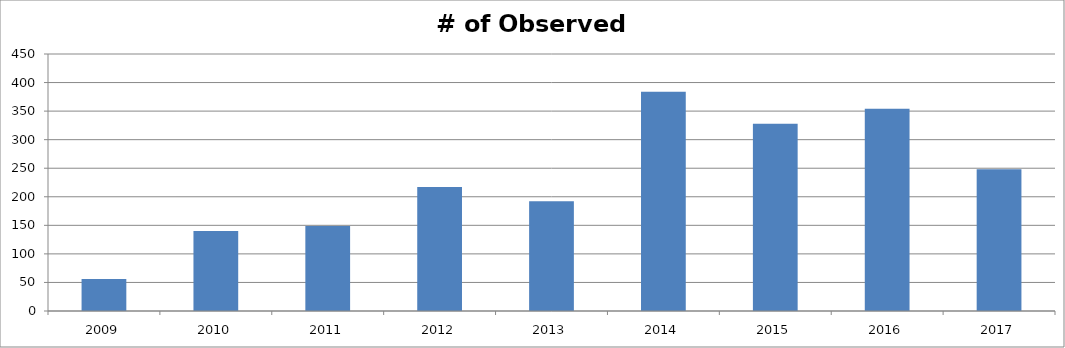
| Category | # of Observed Stands |
|---|---|
| 2009.0 | 56 |
| 2010.0 | 140 |
| 2011.0 | 149 |
| 2012.0 | 217 |
| 2013.0 | 192 |
| 2014.0 | 384 |
| 2015.0 | 328 |
| 2016.0 | 354 |
| 2017.0 | 248 |